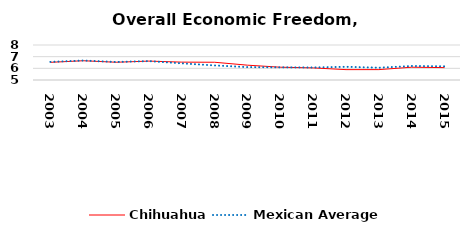
| Category | Chihuahua | Mexican Average  |
|---|---|---|
| 2003.0 | 6.514 | 6.552 |
| 2004.0 | 6.651 | 6.668 |
| 2005.0 | 6.521 | 6.546 |
| 2006.0 | 6.62 | 6.619 |
| 2007.0 | 6.531 | 6.428 |
| 2008.0 | 6.52 | 6.248 |
| 2009.0 | 6.271 | 6.106 |
| 2010.0 | 6.096 | 6.086 |
| 2011.0 | 6.036 | 6.074 |
| 2012.0 | 5.889 | 6.134 |
| 2013.0 | 5.89 | 6.054 |
| 2014.0 | 6.096 | 6.2 |
| 2015.0 | 6.062 | 6.174 |